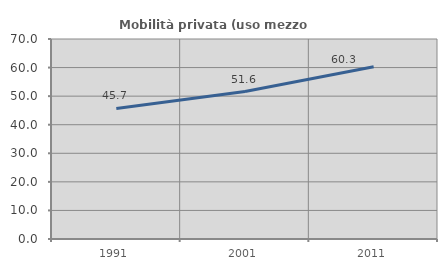
| Category | Mobilità privata (uso mezzo privato) |
|---|---|
| 1991.0 | 45.676 |
| 2001.0 | 51.62 |
| 2011.0 | 60.291 |